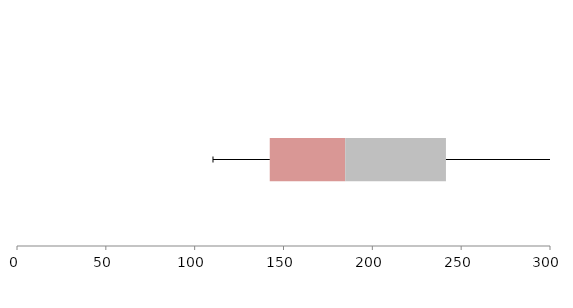
| Category | Series 1 | Series 2 | Series 3 |
|---|---|---|---|
| 0 | 142.265 | 42.474 | 56.701 |